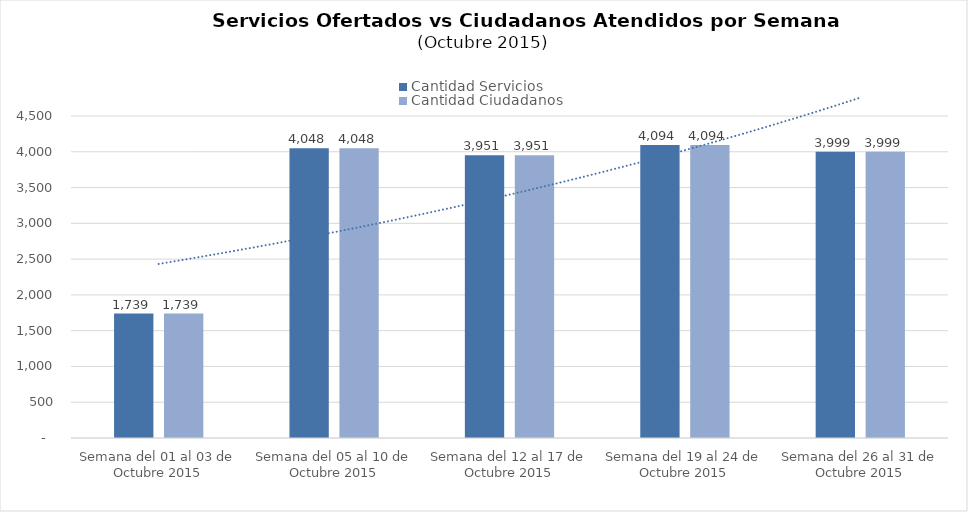
| Category | Cantidad Servicios | Cantidad Ciudadanos |
|---|---|---|
| Semana del 01 al 03 de Octubre 2015 | 1739 | 1739 |
| Semana del 05 al 10 de Octubre 2015 | 4048 | 4048 |
| Semana del 12 al 17 de Octubre 2015 | 3951 | 3951 |
| Semana del 19 al 24 de Octubre 2015 | 4094 | 4094 |
| Semana del 26 al 31 de Octubre 2015 | 3999 | 3999 |